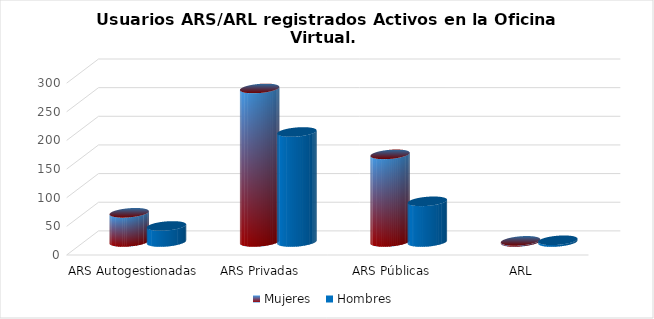
| Category | Mujeres | Hombres |
|---|---|---|
| ARS Autogestionadas | 51 | 28 |
| ARS Privadas | 268 | 192 |
| ARS Públicas | 153 | 71 |
| ARL | 2 | 3 |